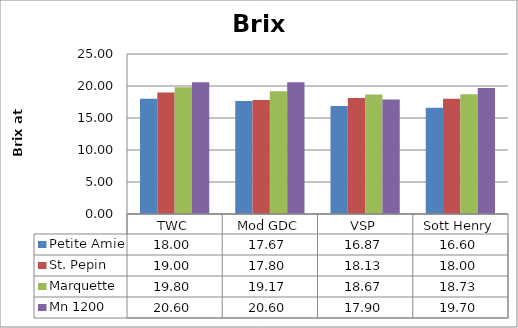
| Category | Petite Amie | St. Pepin | Marquette | Mn 1200 |
|---|---|---|---|---|
| 0 | 18 | 19 | 19.8 | 20.6 |
| 1 | 17.67 | 17.8 | 19.17 | 20.6 |
| 2 | 16.87 | 18.13 | 18.67 | 17.9 |
| 3 | 16.6 | 18 | 18.73 | 19.7 |